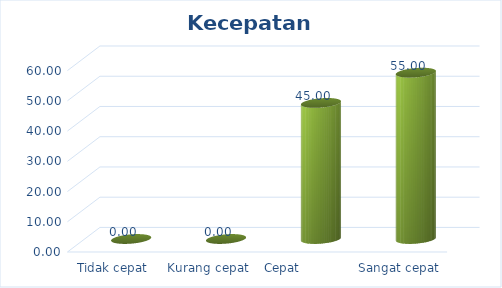
| Category | Kecepatan Pelayanan |
|---|---|
| Tidak cepat | 0 |
| Kurang cepat | 0 |
| Cepat            | 45 |
| Sangat cepat | 55 |